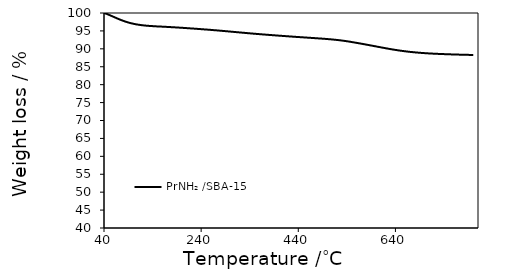
| Category | PrNH₂ /SBA-15 |
|---|---|
| 40.0 | 100 |
| 42.0 | 99.92 |
| 44.0 | 99.824 |
| 46.0 | 99.718 |
| 48.0 | 99.615 |
| 50.0 | 99.497 |
| 52.0 | 99.383 |
| 54.0 | 99.27 |
| 56.0 | 99.153 |
| 58.0 | 99.033 |
| 60.0 | 98.911 |
| 62.0 | 98.793 |
| 64.0 | 98.675 |
| 66.0 | 98.553 |
| 68.0 | 98.438 |
| 70.0 | 98.323 |
| 72.0 | 98.211 |
| 74.0 | 98.1 |
| 76.0 | 97.995 |
| 78.0 | 97.9 |
| 80.0 | 97.801 |
| 82.0 | 97.699 |
| 84.0 | 97.605 |
| 86.0 | 97.517 |
| 88.0 | 97.433 |
| 90.0 | 97.354 |
| 92.0 | 97.278 |
| 94.0 | 97.206 |
| 96.0 | 97.138 |
| 98.0 | 97.074 |
| 100.0 | 97.01 |
| 102.0 | 96.952 |
| 104.0 | 96.896 |
| 106.0 | 96.843 |
| 108.0 | 96.794 |
| 110.0 | 96.757 |
| 112.0 | 96.712 |
| 114.0 | 96.67 |
| 116.0 | 96.635 |
| 118.0 | 96.599 |
| 120.0 | 96.567 |
| 122.0 | 96.535 |
| 124.0 | 96.506 |
| 126.0 | 96.479 |
| 128.0 | 96.453 |
| 130.0 | 96.433 |
| 132.0 | 96.409 |
| 134.0 | 96.387 |
| 136.0 | 96.372 |
| 138.0 | 96.352 |
| 140.0 | 96.338 |
| 142.0 | 96.316 |
| 144.0 | 96.304 |
| 146.0 | 96.29 |
| 148.0 | 96.267 |
| 150.0 | 96.254 |
| 152.0 | 96.241 |
| 154.0 | 96.228 |
| 156.0 | 96.216 |
| 158.0 | 96.203 |
| 160.0 | 96.19 |
| 162.0 | 96.171 |
| 164.0 | 96.158 |
| 166.0 | 96.147 |
| 168.0 | 96.133 |
| 170.0 | 96.112 |
| 172.0 | 96.098 |
| 174.0 | 96.087 |
| 176.0 | 96.067 |
| 178.0 | 96.055 |
| 180.0 | 96.044 |
| 182.0 | 96.025 |
| 184.0 | 96.012 |
| 186.0 | 95.992 |
| 188.0 | 95.981 |
| 190.0 | 95.961 |
| 192.0 | 95.941 |
| 194.0 | 95.926 |
| 196.0 | 95.911 |
| 198.0 | 95.89 |
| 200.0 | 95.872 |
| 202.0 | 95.858 |
| 204.0 | 95.837 |
| 206.0 | 95.819 |
| 208.0 | 95.802 |
| 210.0 | 95.783 |
| 212.0 | 95.763 |
| 214.0 | 95.744 |
| 216.0 | 95.726 |
| 218.0 | 95.705 |
| 220.0 | 95.686 |
| 222.0 | 95.667 |
| 224.0 | 95.65 |
| 226.0 | 95.632 |
| 228.0 | 95.612 |
| 230.0 | 95.593 |
| 232.0 | 95.571 |
| 234.0 | 95.552 |
| 236.0 | 95.532 |
| 238.0 | 95.511 |
| 240.0 | 95.491 |
| 242.0 | 95.47 |
| 244.0 | 95.45 |
| 246.0 | 95.427 |
| 248.0 | 95.408 |
| 250.0 | 95.39 |
| 252.0 | 95.37 |
| 254.0 | 95.348 |
| 256.0 | 95.328 |
| 258.0 | 95.307 |
| 260.0 | 95.283 |
| 262.0 | 95.26 |
| 264.0 | 95.237 |
| 266.0 | 95.215 |
| 268.0 | 95.194 |
| 270.0 | 95.172 |
| 272.0 | 95.15 |
| 274.0 | 95.125 |
| 276.0 | 95.103 |
| 278.0 | 95.08 |
| 280.0 | 95.056 |
| 282.0 | 95.031 |
| 284.0 | 95.006 |
| 286.0 | 94.985 |
| 288.0 | 94.96 |
| 290.0 | 94.937 |
| 292.0 | 94.913 |
| 294.0 | 94.889 |
| 296.0 | 94.863 |
| 298.0 | 94.838 |
| 300.0 | 94.814 |
| 302.0 | 94.789 |
| 304.0 | 94.763 |
| 306.0 | 94.74 |
| 308.0 | 94.715 |
| 310.0 | 94.691 |
| 312.0 | 94.667 |
| 314.0 | 94.642 |
| 316.0 | 94.615 |
| 318.0 | 94.591 |
| 320.0 | 94.566 |
| 322.0 | 94.543 |
| 324.0 | 94.52 |
| 326.0 | 94.494 |
| 328.0 | 94.471 |
| 330.0 | 94.448 |
| 332.0 | 94.424 |
| 334.0 | 94.398 |
| 336.0 | 94.372 |
| 338.0 | 94.35 |
| 340.0 | 94.326 |
| 342.0 | 94.302 |
| 344.0 | 94.278 |
| 346.0 | 94.255 |
| 348.0 | 94.231 |
| 350.0 | 94.211 |
| 352.0 | 94.188 |
| 354.0 | 94.165 |
| 356.0 | 94.145 |
| 358.0 | 94.124 |
| 360.0 | 94.099 |
| 362.0 | 94.076 |
| 364.0 | 94.054 |
| 366.0 | 94.031 |
| 368.0 | 94.011 |
| 370.0 | 93.991 |
| 372.0 | 93.97 |
| 374.0 | 93.949 |
| 376.0 | 93.927 |
| 378.0 | 93.905 |
| 380.0 | 93.883 |
| 382.0 | 93.862 |
| 384.0 | 93.842 |
| 386.0 | 93.822 |
| 388.0 | 93.803 |
| 390.0 | 93.78 |
| 392.0 | 93.76 |
| 394.0 | 93.74 |
| 396.0 | 93.718 |
| 398.0 | 93.701 |
| 400.0 | 93.679 |
| 402.0 | 93.66 |
| 404.0 | 93.641 |
| 406.0 | 93.622 |
| 408.0 | 93.602 |
| 410.0 | 93.582 |
| 412.0 | 93.561 |
| 414.0 | 93.542 |
| 416.0 | 93.524 |
| 418.0 | 93.501 |
| 420.0 | 93.481 |
| 422.0 | 93.465 |
| 424.0 | 93.445 |
| 426.0 | 93.426 |
| 428.0 | 93.405 |
| 430.0 | 93.385 |
| 432.0 | 93.371 |
| 434.0 | 93.349 |
| 436.0 | 93.326 |
| 438.0 | 93.315 |
| 440.0 | 93.293 |
| 442.0 | 93.274 |
| 444.0 | 93.26 |
| 446.0 | 93.241 |
| 448.0 | 93.222 |
| 450.0 | 93.202 |
| 452.0 | 93.187 |
| 454.0 | 93.167 |
| 456.0 | 93.149 |
| 458.0 | 93.13 |
| 460.0 | 93.112 |
| 462.0 | 93.093 |
| 464.0 | 93.077 |
| 466.0 | 93.058 |
| 468.0 | 93.037 |
| 470.0 | 93.021 |
| 472.0 | 93.004 |
| 474.0 | 92.984 |
| 476.0 | 92.967 |
| 478.0 | 92.948 |
| 480.0 | 92.927 |
| 482.0 | 92.911 |
| 484.0 | 92.888 |
| 486.0 | 92.873 |
| 488.0 | 92.854 |
| 490.0 | 92.83 |
| 492.0 | 92.811 |
| 494.0 | 92.792 |
| 496.0 | 92.774 |
| 498.0 | 92.751 |
| 500.0 | 92.728 |
| 502.0 | 92.705 |
| 504.0 | 92.682 |
| 506.0 | 92.659 |
| 508.0 | 92.637 |
| 510.0 | 92.611 |
| 512.0 | 92.581 |
| 514.0 | 92.559 |
| 516.0 | 92.531 |
| 518.0 | 92.503 |
| 520.0 | 92.473 |
| 522.0 | 92.439 |
| 524.0 | 92.414 |
| 526.0 | 92.379 |
| 528.0 | 92.349 |
| 530.0 | 92.312 |
| 532.0 | 92.274 |
| 534.0 | 92.24 |
| 536.0 | 92.198 |
| 538.0 | 92.159 |
| 540.0 | 92.12 |
| 542.0 | 92.075 |
| 544.0 | 92.036 |
| 546.0 | 91.989 |
| 548.0 | 91.946 |
| 550.0 | 91.899 |
| 552.0 | 91.853 |
| 554.0 | 91.806 |
| 556.0 | 91.759 |
| 558.0 | 91.715 |
| 560.0 | 91.666 |
| 562.0 | 91.621 |
| 564.0 | 91.57 |
| 566.0 | 91.524 |
| 568.0 | 91.474 |
| 570.0 | 91.429 |
| 572.0 | 91.377 |
| 574.0 | 91.326 |
| 576.0 | 91.281 |
| 578.0 | 91.23 |
| 580.0 | 91.18 |
| 582.0 | 91.13 |
| 584.0 | 91.08 |
| 586.0 | 91.027 |
| 588.0 | 90.98 |
| 590.0 | 90.924 |
| 592.0 | 90.877 |
| 594.0 | 90.824 |
| 596.0 | 90.776 |
| 598.0 | 90.726 |
| 600.0 | 90.677 |
| 602.0 | 90.616 |
| 604.0 | 90.572 |
| 606.0 | 90.515 |
| 608.0 | 90.469 |
| 610.0 | 90.415 |
| 612.0 | 90.364 |
| 614.0 | 90.312 |
| 616.0 | 90.266 |
| 618.0 | 90.213 |
| 620.0 | 90.167 |
| 622.0 | 90.115 |
| 624.0 | 90.068 |
| 626.0 | 90.017 |
| 628.0 | 89.971 |
| 630.0 | 89.922 |
| 632.0 | 89.88 |
| 634.0 | 89.832 |
| 636.0 | 89.789 |
| 638.0 | 89.742 |
| 640.0 | 89.701 |
| 642.0 | 89.658 |
| 644.0 | 89.617 |
| 646.0 | 89.567 |
| 648.0 | 89.533 |
| 650.0 | 89.494 |
| 652.0 | 89.458 |
| 654.0 | 89.422 |
| 656.0 | 89.383 |
| 658.0 | 89.35 |
| 660.0 | 89.31 |
| 662.0 | 89.282 |
| 664.0 | 89.246 |
| 666.0 | 89.215 |
| 668.0 | 89.183 |
| 670.0 | 89.152 |
| 672.0 | 89.125 |
| 674.0 | 89.1 |
| 676.0 | 89.072 |
| 678.0 | 89.041 |
| 680.0 | 89.019 |
| 682.0 | 88.993 |
| 684.0 | 88.969 |
| 686.0 | 88.945 |
| 688.0 | 88.92 |
| 690.0 | 88.902 |
| 692.0 | 88.876 |
| 694.0 | 88.859 |
| 696.0 | 88.84 |
| 698.0 | 88.816 |
| 700.0 | 88.801 |
| 702.0 | 88.78 |
| 704.0 | 88.765 |
| 706.0 | 88.745 |
| 708.0 | 88.731 |
| 710.0 | 88.716 |
| 712.0 | 88.697 |
| 714.0 | 88.686 |
| 716.0 | 88.669 |
| 718.0 | 88.655 |
| 720.0 | 88.645 |
| 722.0 | 88.628 |
| 724.0 | 88.617 |
| 726.0 | 88.6 |
| 728.0 | 88.591 |
| 730.0 | 88.578 |
| 732.0 | 88.565 |
| 734.0 | 88.555 |
| 736.0 | 88.542 |
| 738.0 | 88.533 |
| 740.0 | 88.526 |
| 742.0 | 88.511 |
| 744.0 | 88.503 |
| 746.0 | 88.491 |
| 748.0 | 88.478 |
| 750.0 | 88.474 |
| 752.0 | 88.46 |
| 754.0 | 88.455 |
| 756.0 | 88.447 |
| 758.0 | 88.435 |
| 760.0 | 88.429 |
| 762.0 | 88.419 |
| 764.0 | 88.41 |
| 766.0 | 88.41 |
| 768.0 | 88.391 |
| 770.0 | 88.386 |
| 772.0 | 88.379 |
| 774.0 | 88.368 |
| 776.0 | 88.368 |
| 778.0 | 88.356 |
| 780.0 | 88.35 |
| 782.0 | 88.348 |
| 784.0 | 88.334 |
| 786.0 | 88.33 |
| 788.0 | 88.324 |
| 790.0 | 88.316 |
| 792.0 | 88.309 |
| 794.0 | 88.303 |
| 796.0 | 88.299 |
| 798.0 | 88.291 |
| 800.0 | 88.291 |